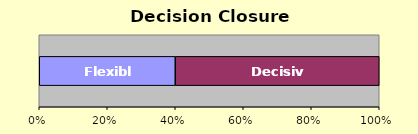
| Category | Flexible | Decisive |
|---|---|---|
| 0 | 2 | 3 |